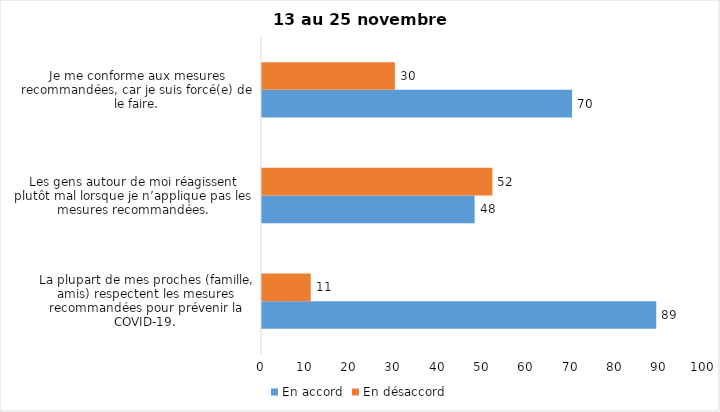
| Category | En accord | En désaccord |
|---|---|---|
| La plupart de mes proches (famille, amis) respectent les mesures recommandées pour prévenir la COVID-19. | 89 | 11 |
| Les gens autour de moi réagissent plutôt mal lorsque je n’applique pas les mesures recommandées. | 48 | 52 |
| Je me conforme aux mesures recommandées, car je suis forcé(e) de le faire. | 70 | 30 |